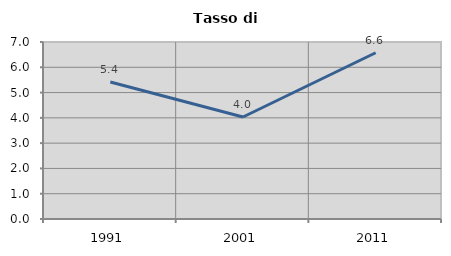
| Category | Tasso di disoccupazione   |
|---|---|
| 1991.0 | 5.417 |
| 2001.0 | 4.034 |
| 2011.0 | 6.575 |